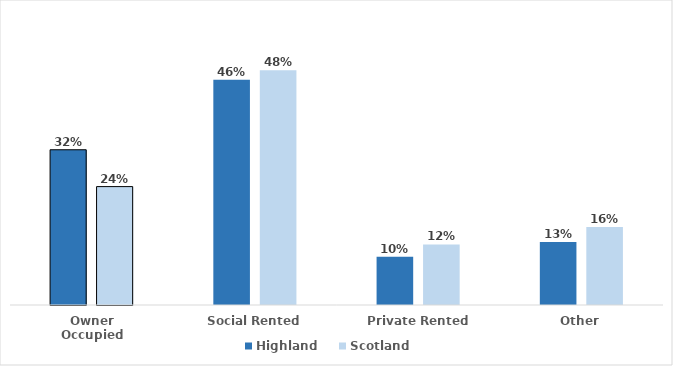
| Category | Highland | Scotland |
|---|---|---|
| Owner Occupied | 0.316 | 0.241 |
| Social Rented | 0.458 | 0.477 |
| Private Rented | 0.098 | 0.123 |
| Other | 0.128 | 0.159 |